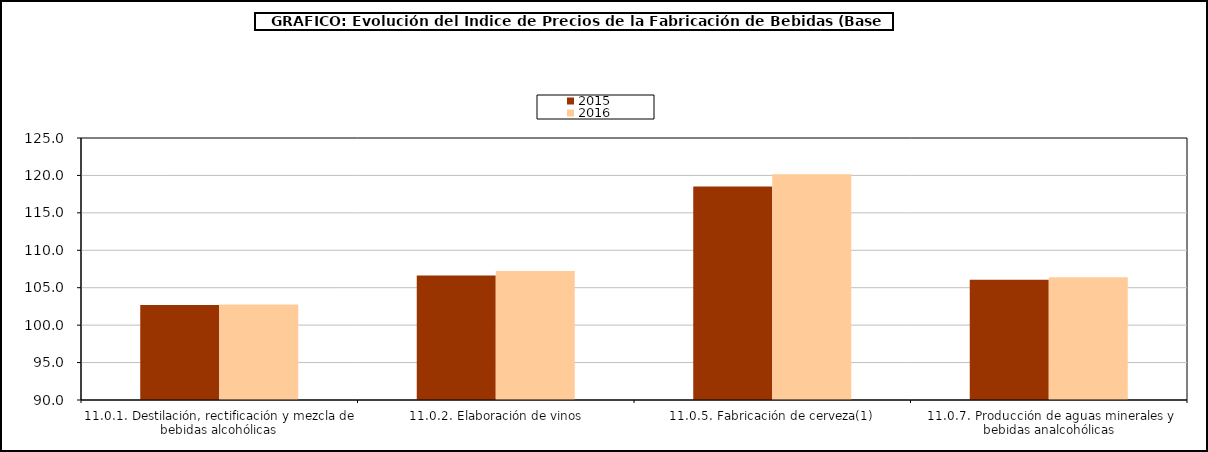
| Category | 2015 | 2016 |
|---|---|---|
| 11.0.1. Destilación, rectificación y mezcla de bebidas alcohólicas | 102.676 | 102.772 |
| 11.0.2. Elaboración de vinos | 106.638 | 107.249 |
| 11.0.5. Fabricación de cerveza(1) | 118.508 | 120.158 |
| 11.0.7. Producción de aguas minerales y bebidas analcohólicas | 106.07 | 106.397 |